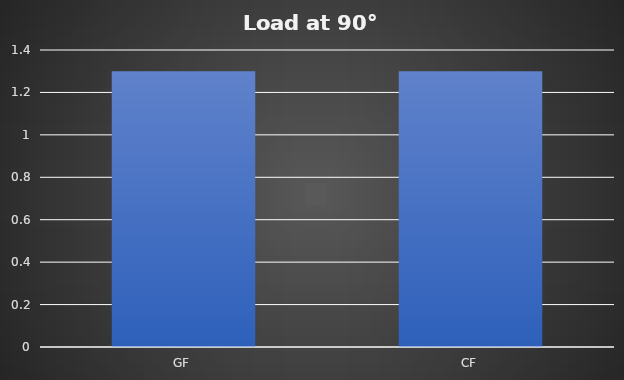
| Category | Load at 90° |
|---|---|
| GF | 1.3 |
| CF | 1.3 |